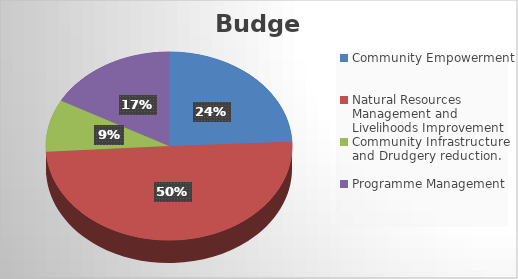
| Category | Budget |
|---|---|
| Community Empowerment | 232446435 |
| Natural Resources Management and Livelihoods Improvement | 477020200 |
| Community Infrastructure and Drudgery reduction. | 85985000 |
| Programme Management | 162865200 |